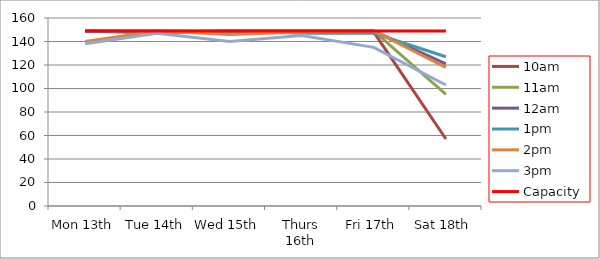
| Category | 9am | 10am | 11am | 12am | 1pm | 2pm | 3pm | 4pm | 5pm | Capacity |
|---|---|---|---|---|---|---|---|---|---|---|
| Mon 13th |  | 149 | 149 | 149 | 149 | 140 | 138 |  |  | 149 |
| Tue 14th |  | 149 | 149 | 148 | 147 | 149 | 147 |  |  | 149 |
| Wed 15th |  | 148 | 149 | 149 | 149 | 146 | 140 |  |  | 149 |
| Thurs 16th |  | 148 | 149 | 149 | 147 | 148 | 145 |  |  | 149 |
| Fri 17th |  | 148 | 149 | 149 | 147 | 149 | 135 |  |  | 149 |
| Sat 18th |  | 57 | 95 | 121 | 127 | 118 | 103 |  |  | 149 |